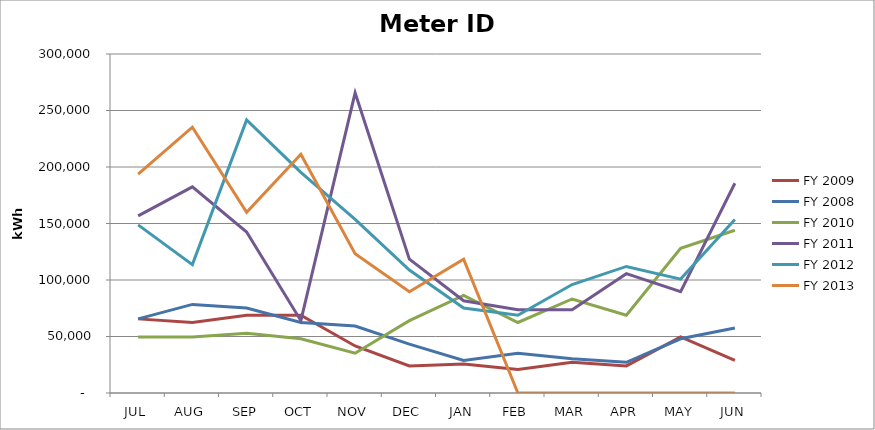
| Category | FY 2009 | FY 2008 | FY 2010 | FY 2011 | FY 2012 | FY 2013 |
|---|---|---|---|---|---|---|
| JUL | 65600 | 65600 | 49600 | 156800 | 148800 | 193600 |
| AUG | 62400 | 78400 | 49600 | 182400 | 113600 | 235200 |
| SEP | 68800 | 75200 | 52800 | 142400 | 241600 | 160000 |
| OCT | 68800 | 62400 | 48000 | 64000 | 195200 | 211200 |
| NOV | 41600 | 59200 | 35200 | 265600 | 153600 | 123200 |
| DEC | 24000 | 43200 | 64000 | 118400 | 108800 | 89600 |
| JAN | 25600 | 28800 | 86400 | 81600 | 75200 | 118400 |
| FEB | 20800 | 35200 | 62400 | 73600 | 68800 | 0 |
| MAR | 27200 | 30400 | 83200 | 73600 | 96000 | 0 |
| APR | 24000 | 27200 | 68800 | 105600 | 112000 | 0 |
| MAY | 49600 | 48000 | 128000 | 89600 | 100800 | 0 |
| JUN | 28800 | 57600 | 144000 | 185600 | 153600 | 0 |